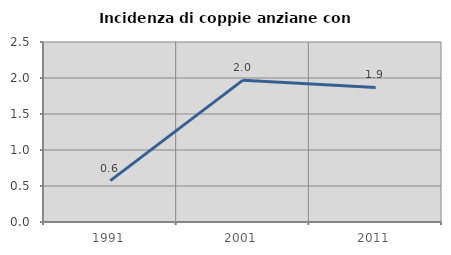
| Category | Incidenza di coppie anziane con figli |
|---|---|
| 1991.0 | 0.575 |
| 2001.0 | 1.97 |
| 2011.0 | 1.869 |